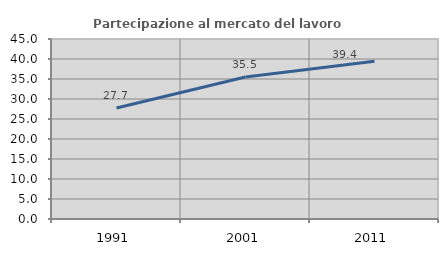
| Category | Partecipazione al mercato del lavoro  femminile |
|---|---|
| 1991.0 | 27.729 |
| 2001.0 | 35.521 |
| 2011.0 | 39.448 |